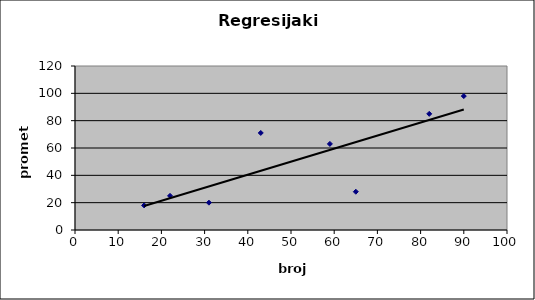
| Category | Series 0 |
|---|---|
| 16.0 | 18 |
| 59.0 | 63 |
| 65.0 | 28 |
| 43.0 | 71 |
| 82.0 | 85 |
| 90.0 | 98 |
| 31.0 | 20 |
| 22.0 | 25 |